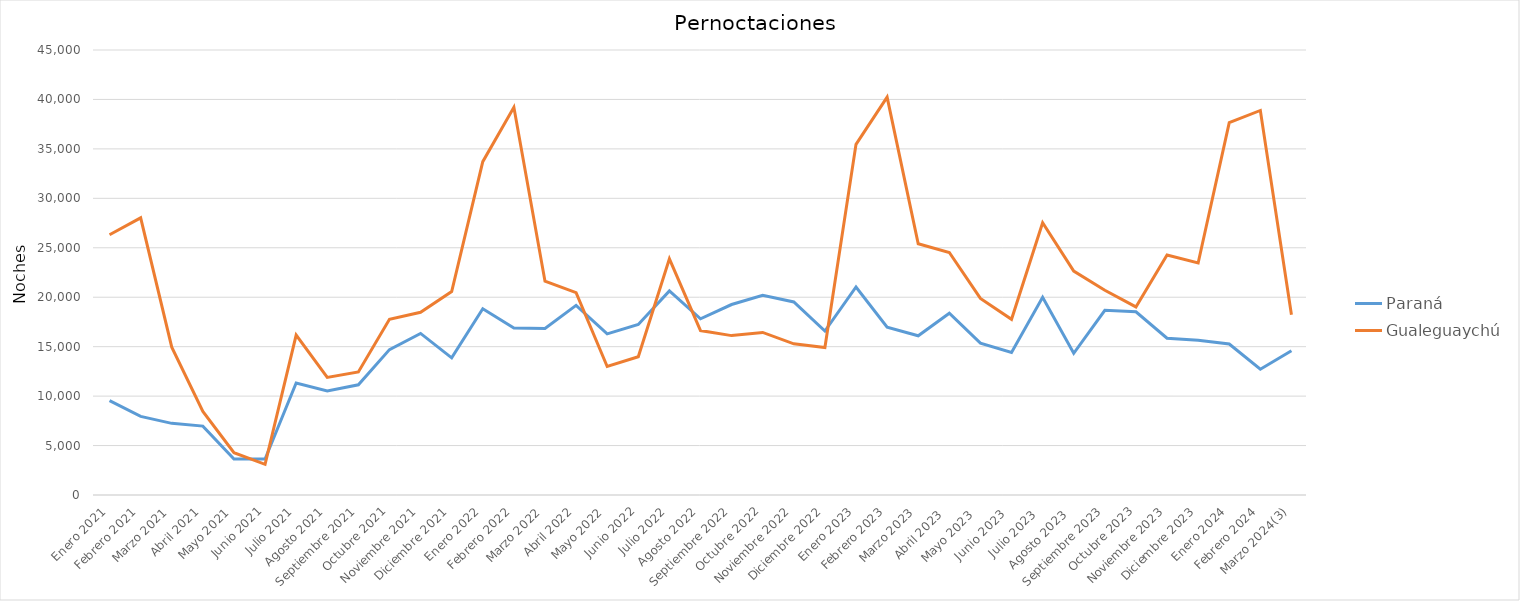
| Category | Paraná | Gualeguaychú |
|---|---|---|
| Enero 2021 | 9544 | 26317 |
| Febrero 2021 | 7945 | 28026 |
| Marzo 2021 | 7245 | 14944 |
| Abril 2021 | 6968 | 8459 |
| Mayo 2021 | 3643 | 4284 |
| Junio 2021 | 3638 | 3100 |
| Julio 2021 | 11324 | 16173 |
| Agosto 2021 | 10522 | 11895 |
| Septiembre 2021 | 11148 | 12448 |
| Octubre 2021 | 14704 | 17771 |
| Noviembre 2021 | 16340 | 18481 |
| Diciembre 2021 | 13870 | 20581 |
| Enero 2022 | 18832 | 33707 |
| Febrero 2022 | 16877 | 39202 |
| Marzo 2022 | 16838 | 21614 |
| Abril 2022 | 19176 | 20463 |
| Mayo 2022 | 16289 | 12993 |
| Junio 2022 | 17238 | 13975 |
| Julio 2022 | 20636 | 23882 |
| Agosto 2022 | 17815 | 16628 |
| Septiembre 2022 | 19262 | 16118 |
| Octubre 2022 | 20193 | 16437 |
| Noviembre 2022 | 19519 | 15291 |
| Diciembre 2022 | 16575 | 14919 |
| Enero 2023 | 21036 | 35456 |
| Febrero 2023 | 16966 | 40231 |
| Marzo 2023 | 16097 | 25403 |
| Abril 2023  | 18387 | 24526 |
| Mayo 2023  | 15354 | 19882 |
| Junio 2023  | 14412 | 17770 |
| Julio 2023  | 19992 | 27533 |
| Agosto 2023  | 14326 | 22643 |
| Septiembre 2023 | 18670 | 20698 |
| Octubre 2023 | 18525 | 19019 |
| Noviembre 2023 | 15856 | 24263 |
| Diciembre 2023 | 15644 | 23460 |
| Enero 2024 | 15264 | 37649 |
| Febrero 2024 | 12717 | 38886 |
| Marzo 2024(3) | 14583 | 18231 |